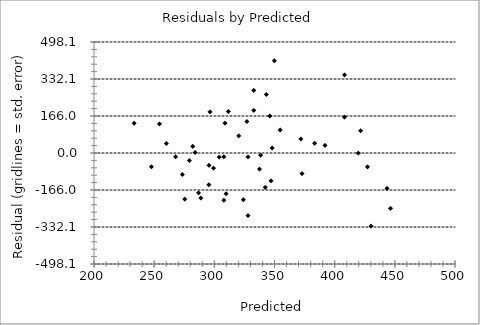
| Category | Series 0 |
|---|---|
| 421.5658640380706 | 99.434 |
| 233.41079035918813 | 133.589 |
| 308.86384021011054 | 134.136 |
| 427.29647541915324 | -62.296 |
| 332.7413876312885 | 281.259 |
| 254.42303208982474 | 130.577 |
| 304.0883307258749 | -18.088 |
| 320.32506297227593 | 76.675 |
| 349.9332217745366 | 414.067 |
| 383.3617881641858 | 43.638 |
| 295.49241365425087 | -142.492 |
| 299.3128212416393 | -68.313 |
| 332.7413876312885 | 191.259 |
| 338.47199901237116 | -10.472 |
| 295.49241365425087 | -55.492 |
| 284.0311908920854 | 1.969 |
| 443.5332076655542 | -158.533 |
| 408.1944374822108 | 160.806 |
| 307.90873831326337 | -211.909 |
| 311.7291459006519 | 186.271 |
| 296.4475155510979 | 184.552 |
| 327.01077625020577 | 140.989 |
| 273.52507002676714 | -96.525 |
| 446.3985133560956 | -248.399 |
| 354.7087312587722 | 103.291 |
| 286.8964965826268 | -178.896 |
| 279.2556814078498 | -33.256 |
| 307.90873831326337 | -16.909 |
| 275.43527382046136 | -207.435 |
| 327.9658781470529 | -16.966 |
| 343.24750849660677 | 262.752 |
| 346.11281418714816 | 165.887 |
| 391.95770523580984 | 34.042 |
| 327.9658781470529 | -280.966 |
| 337.5168971155241 | -72.517 |
| 348.0230179808424 | 21.977 |
| 282.1209870983912 | 29.879 |
| 347.06791608399527 | -125.068 |
| 372.8556672988675 | -92.856 |
| 408.1944374822108 | 350.806 |
| 324.14547055966443 | -210.145 |
| 419.65566024437624 | -0.656 |
| 371.90056540202033 | 63.099 |
| 247.7373188118949 | -61.737 |
| 288.80670037632103 | -201.807 |
| 342.29240659975966 | -154.292 |
| 260.15364347090747 | 42.846 |
| 430.16178110969463 | -328.162 |
| 309.8189421069576 | -182.819 |
| 267.7944586456844 | -16.794 |